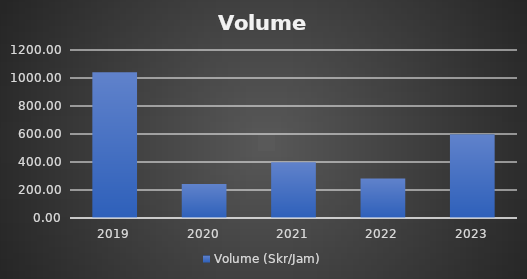
| Category | Volume (Skr/Jam) |
|---|---|
| 2019.0 | 1040.436 |
| 2020.0 | 242.79 |
| 2021.0 | 398.186 |
| 2022.0 | 282.52 |
| 2023.0 | 595.976 |